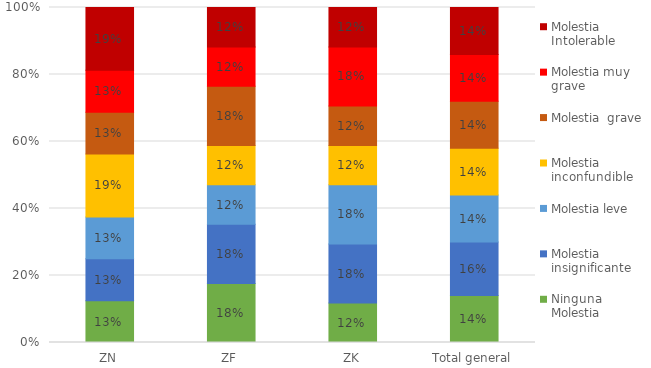
| Category | Ninguna Molestia | Molestia insignificante | Molestia leve | Molestia inconfundible | Molestia  grave | Molestia muy grave | Molestia Intolerable |
|---|---|---|---|---|---|---|---|
| ZN | 0.125 | 0.125 | 0.125 | 0.188 | 0.125 | 0.125 | 0.188 |
| ZF | 0.176 | 0.176 | 0.118 | 0.118 | 0.176 | 0.118 | 0.118 |
| ZK | 0.118 | 0.176 | 0.176 | 0.118 | 0.118 | 0.176 | 0.118 |
| Total general | 0.14 | 0.16 | 0.14 | 0.14 | 0.14 | 0.14 | 0.14 |